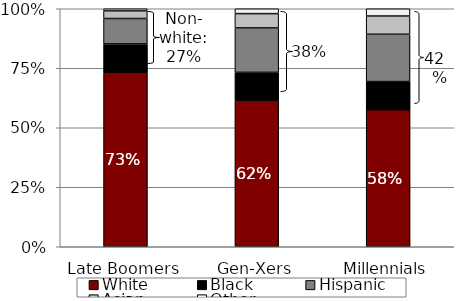
| Category | White | Black | Hispanic | Asian | Other |
|---|---|---|---|---|---|
| Late Boomers | 0.733 | 0.119 | 0.107 | 0.032 | 0.009 |
| Gen-Xers | 0.616 | 0.117 | 0.187 | 0.06 | 0.02 |
| Millennials | 0.576 | 0.118 | 0.199 | 0.077 | 0.03 |